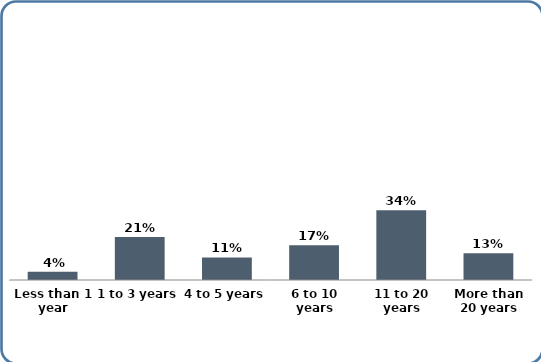
| Category | Series 0 |
|---|---|
| Less than 1 year | 0.04 |
| 1 to 3 years | 0.21 |
| 4 to 5 years | 0.11 |
| 6 to 10 years | 0.17 |
| 11 to 20 years | 0.34 |
| More than 20 years | 0.13 |